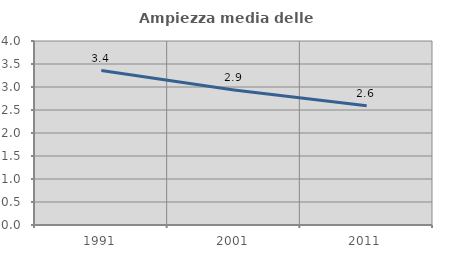
| Category | Ampiezza media delle famiglie |
|---|---|
| 1991.0 | 3.358 |
| 2001.0 | 2.934 |
| 2011.0 | 2.593 |